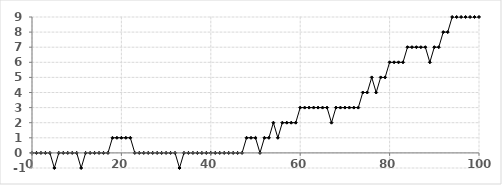
| Category | Series 0 |
|---|---|
| 0.0 | 0 |
| 1.0 | 0 |
| 2.0 | 0 |
| 3.0 | 0 |
| 4.0 | 0 |
| 5.0 | -1 |
| 6.0 | 0 |
| 7.0 | 0 |
| 8.0 | 0 |
| 9.0 | 0 |
| 10.0 | 0 |
| 11.0 | -1 |
| 12.0 | 0 |
| 13.0 | 0 |
| 14.0 | 0 |
| 15.0 | 0 |
| 16.0 | 0 |
| 17.0 | 0 |
| 18.0 | 1 |
| 19.0 | 1 |
| 20.0 | 1 |
| 21.0 | 1 |
| 22.0 | 1 |
| 23.0 | 0 |
| 24.0 | 0 |
| 25.0 | 0 |
| 26.0 | 0 |
| 27.0 | 0 |
| 28.0 | 0 |
| 29.0 | 0 |
| 30.0 | 0 |
| 31.0 | 0 |
| 32.0 | 0 |
| 33.0 | -1 |
| 34.0 | 0 |
| 35.0 | 0 |
| 36.0 | 0 |
| 37.0 | 0 |
| 38.0 | 0 |
| 39.0 | 0 |
| 40.0 | 0 |
| 41.0 | 0 |
| 42.0 | 0 |
| 43.0 | 0 |
| 44.0 | 0 |
| 45.0 | 0 |
| 46.0 | 0 |
| 47.0 | 0 |
| 48.0 | 1 |
| 49.0 | 1 |
| 50.0 | 1 |
| 51.0 | 0 |
| 52.0 | 1 |
| 53.0 | 1 |
| 54.0 | 2 |
| 55.0 | 1 |
| 56.0 | 2 |
| 57.0 | 2 |
| 58.0 | 2 |
| 59.0 | 2 |
| 60.0 | 3 |
| 61.0 | 3 |
| 62.0 | 3 |
| 63.0 | 3 |
| 64.0 | 3 |
| 65.0 | 3 |
| 66.0 | 3 |
| 67.0 | 2 |
| 68.0 | 3 |
| 69.0 | 3 |
| 70.0 | 3 |
| 71.0 | 3 |
| 72.0 | 3 |
| 73.0 | 3 |
| 74.0 | 4 |
| 75.0 | 4 |
| 76.0 | 5 |
| 77.0 | 4 |
| 78.0 | 5 |
| 79.0 | 5 |
| 80.0 | 6 |
| 81.0 | 6 |
| 82.0 | 6 |
| 83.0 | 6 |
| 84.0 | 7 |
| 85.0 | 7 |
| 86.0 | 7 |
| 87.0 | 7 |
| 88.0 | 7 |
| 89.0 | 6 |
| 90.0 | 7 |
| 91.0 | 7 |
| 92.0 | 8 |
| 93.0 | 8 |
| 94.0 | 9 |
| 95.0 | 9 |
| 96.0 | 9 |
| 97.0 | 9 |
| 98.0 | 9 |
| 99.0 | 9 |
| 100.0 | 9 |